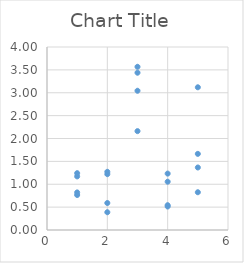
| Category | Series 0 |
|---|---|
| 1.0 | 1.242 |
| 1.0 | 1.172 |
| 1.0 | 0.821 |
| 1.0 | 0.765 |
| 2.0 | 1.221 |
| 2.0 | 1.272 |
| 2.0 | 0.59 |
| 2.0 | 0.388 |
| 3.0 | 3.438 |
| 3.0 | 3.567 |
| 3.0 | 2.161 |
| 3.0 | 3.044 |
| 4.0 | 1.233 |
| 4.0 | 1.056 |
| 4.0 | 0.513 |
| 4.0 | 0.542 |
| 5.0 | 3.12 |
| 5.0 | 1.366 |
| 5.0 | 1.664 |
| 5.0 | 0.825 |